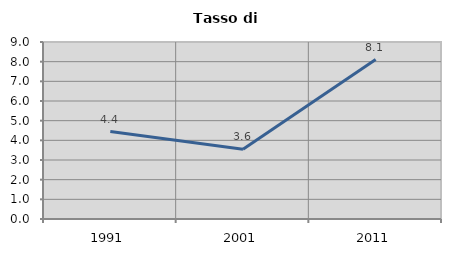
| Category | Tasso di disoccupazione   |
|---|---|
| 1991.0 | 4.444 |
| 2001.0 | 3.552 |
| 2011.0 | 8.107 |